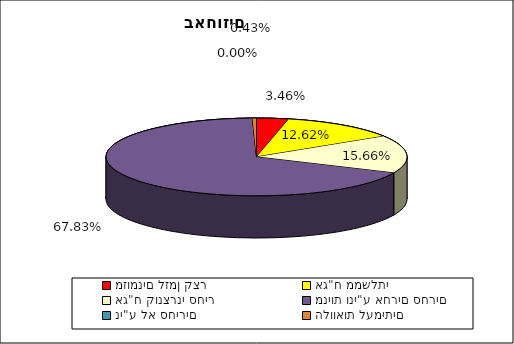
| Category | Series 0 |
|---|---|
| מזומנים לזמן קצר | 0.035 |
| אג"ח ממשלתי | 0.126 |
| אג"ח קונצרני סחיר | 0.157 |
| מניות וני"ע אחרים סחרים | 0.678 |
| ני"ע לא סחירים | 0 |
| הלוואות לעמיתים | 0.004 |